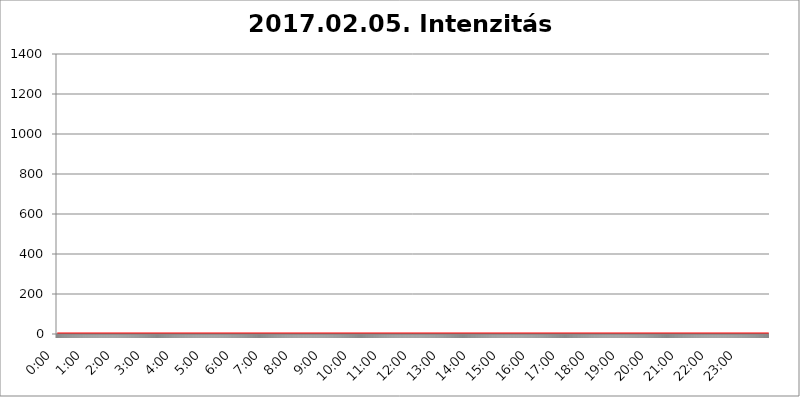
| Category | 2017.02.05. Intenzitás [W/m^2] |
|---|---|
| 0.0 | 0 |
| 0.0006944444444444445 | 0 |
| 0.001388888888888889 | 0 |
| 0.0020833333333333333 | 0 |
| 0.002777777777777778 | 0 |
| 0.003472222222222222 | 0 |
| 0.004166666666666667 | 0 |
| 0.004861111111111111 | 0 |
| 0.005555555555555556 | 0 |
| 0.0062499999999999995 | 0 |
| 0.006944444444444444 | 0 |
| 0.007638888888888889 | 0 |
| 0.008333333333333333 | 0 |
| 0.009027777777777779 | 0 |
| 0.009722222222222222 | 0 |
| 0.010416666666666666 | 0 |
| 0.011111111111111112 | 0 |
| 0.011805555555555555 | 0 |
| 0.012499999999999999 | 0 |
| 0.013194444444444444 | 0 |
| 0.013888888888888888 | 0 |
| 0.014583333333333332 | 0 |
| 0.015277777777777777 | 0 |
| 0.015972222222222224 | 0 |
| 0.016666666666666666 | 0 |
| 0.017361111111111112 | 0 |
| 0.018055555555555557 | 0 |
| 0.01875 | 0 |
| 0.019444444444444445 | 0 |
| 0.02013888888888889 | 0 |
| 0.020833333333333332 | 0 |
| 0.02152777777777778 | 0 |
| 0.022222222222222223 | 0 |
| 0.02291666666666667 | 0 |
| 0.02361111111111111 | 0 |
| 0.024305555555555556 | 0 |
| 0.024999999999999998 | 0 |
| 0.025694444444444447 | 0 |
| 0.02638888888888889 | 0 |
| 0.027083333333333334 | 0 |
| 0.027777777777777776 | 0 |
| 0.02847222222222222 | 0 |
| 0.029166666666666664 | 0 |
| 0.029861111111111113 | 0 |
| 0.030555555555555555 | 0 |
| 0.03125 | 0 |
| 0.03194444444444445 | 0 |
| 0.03263888888888889 | 0 |
| 0.03333333333333333 | 0 |
| 0.034027777777777775 | 0 |
| 0.034722222222222224 | 0 |
| 0.035416666666666666 | 0 |
| 0.036111111111111115 | 0 |
| 0.03680555555555556 | 0 |
| 0.0375 | 0 |
| 0.03819444444444444 | 0 |
| 0.03888888888888889 | 0 |
| 0.03958333333333333 | 0 |
| 0.04027777777777778 | 0 |
| 0.04097222222222222 | 0 |
| 0.041666666666666664 | 0 |
| 0.042361111111111106 | 0 |
| 0.04305555555555556 | 0 |
| 0.043750000000000004 | 0 |
| 0.044444444444444446 | 0 |
| 0.04513888888888889 | 0 |
| 0.04583333333333334 | 0 |
| 0.04652777777777778 | 0 |
| 0.04722222222222222 | 0 |
| 0.04791666666666666 | 0 |
| 0.04861111111111111 | 0 |
| 0.049305555555555554 | 0 |
| 0.049999999999999996 | 0 |
| 0.05069444444444445 | 0 |
| 0.051388888888888894 | 0 |
| 0.052083333333333336 | 0 |
| 0.05277777777777778 | 0 |
| 0.05347222222222222 | 0 |
| 0.05416666666666667 | 0 |
| 0.05486111111111111 | 0 |
| 0.05555555555555555 | 0 |
| 0.05625 | 0 |
| 0.05694444444444444 | 0 |
| 0.057638888888888885 | 0 |
| 0.05833333333333333 | 0 |
| 0.05902777777777778 | 0 |
| 0.059722222222222225 | 0 |
| 0.06041666666666667 | 0 |
| 0.061111111111111116 | 0 |
| 0.06180555555555556 | 0 |
| 0.0625 | 0 |
| 0.06319444444444444 | 0 |
| 0.06388888888888888 | 0 |
| 0.06458333333333334 | 0 |
| 0.06527777777777778 | 0 |
| 0.06597222222222222 | 0 |
| 0.06666666666666667 | 0 |
| 0.06736111111111111 | 0 |
| 0.06805555555555555 | 0 |
| 0.06874999999999999 | 0 |
| 0.06944444444444443 | 0 |
| 0.07013888888888889 | 0 |
| 0.07083333333333333 | 0 |
| 0.07152777777777779 | 0 |
| 0.07222222222222223 | 0 |
| 0.07291666666666667 | 0 |
| 0.07361111111111111 | 0 |
| 0.07430555555555556 | 0 |
| 0.075 | 0 |
| 0.07569444444444444 | 0 |
| 0.0763888888888889 | 0 |
| 0.07708333333333334 | 0 |
| 0.07777777777777778 | 0 |
| 0.07847222222222222 | 0 |
| 0.07916666666666666 | 0 |
| 0.0798611111111111 | 0 |
| 0.08055555555555556 | 0 |
| 0.08125 | 0 |
| 0.08194444444444444 | 0 |
| 0.08263888888888889 | 0 |
| 0.08333333333333333 | 0 |
| 0.08402777777777777 | 0 |
| 0.08472222222222221 | 0 |
| 0.08541666666666665 | 0 |
| 0.08611111111111112 | 0 |
| 0.08680555555555557 | 0 |
| 0.08750000000000001 | 0 |
| 0.08819444444444445 | 0 |
| 0.08888888888888889 | 0 |
| 0.08958333333333333 | 0 |
| 0.09027777777777778 | 0 |
| 0.09097222222222222 | 0 |
| 0.09166666666666667 | 0 |
| 0.09236111111111112 | 0 |
| 0.09305555555555556 | 0 |
| 0.09375 | 0 |
| 0.09444444444444444 | 0 |
| 0.09513888888888888 | 0 |
| 0.09583333333333333 | 0 |
| 0.09652777777777777 | 0 |
| 0.09722222222222222 | 0 |
| 0.09791666666666667 | 0 |
| 0.09861111111111111 | 0 |
| 0.09930555555555555 | 0 |
| 0.09999999999999999 | 0 |
| 0.10069444444444443 | 0 |
| 0.1013888888888889 | 0 |
| 0.10208333333333335 | 0 |
| 0.10277777777777779 | 0 |
| 0.10347222222222223 | 0 |
| 0.10416666666666667 | 0 |
| 0.10486111111111111 | 0 |
| 0.10555555555555556 | 0 |
| 0.10625 | 0 |
| 0.10694444444444444 | 0 |
| 0.1076388888888889 | 0 |
| 0.10833333333333334 | 0 |
| 0.10902777777777778 | 0 |
| 0.10972222222222222 | 0 |
| 0.1111111111111111 | 0 |
| 0.11180555555555556 | 0 |
| 0.11180555555555556 | 0 |
| 0.1125 | 0 |
| 0.11319444444444444 | 0 |
| 0.11388888888888889 | 0 |
| 0.11458333333333333 | 0 |
| 0.11527777777777777 | 0 |
| 0.11597222222222221 | 0 |
| 0.11666666666666665 | 0 |
| 0.1173611111111111 | 0 |
| 0.11805555555555557 | 0 |
| 0.11944444444444445 | 0 |
| 0.12013888888888889 | 0 |
| 0.12083333333333333 | 0 |
| 0.12152777777777778 | 0 |
| 0.12222222222222223 | 0 |
| 0.12291666666666667 | 0 |
| 0.12291666666666667 | 0 |
| 0.12361111111111112 | 0 |
| 0.12430555555555556 | 0 |
| 0.125 | 0 |
| 0.12569444444444444 | 0 |
| 0.12638888888888888 | 0 |
| 0.12708333333333333 | 0 |
| 0.16875 | 0 |
| 0.12847222222222224 | 0 |
| 0.12916666666666668 | 0 |
| 0.12986111111111112 | 0 |
| 0.13055555555555556 | 0 |
| 0.13125 | 0 |
| 0.13194444444444445 | 0 |
| 0.1326388888888889 | 0 |
| 0.13333333333333333 | 0 |
| 0.13402777777777777 | 0 |
| 0.13402777777777777 | 0 |
| 0.13472222222222222 | 0 |
| 0.13541666666666666 | 0 |
| 0.1361111111111111 | 0 |
| 0.13749999999999998 | 0 |
| 0.13819444444444443 | 0 |
| 0.1388888888888889 | 0 |
| 0.13958333333333334 | 0 |
| 0.14027777777777778 | 0 |
| 0.14097222222222222 | 0 |
| 0.14166666666666666 | 0 |
| 0.1423611111111111 | 0 |
| 0.14305555555555557 | 0 |
| 0.14375000000000002 | 0 |
| 0.14444444444444446 | 0 |
| 0.1451388888888889 | 0 |
| 0.1451388888888889 | 0 |
| 0.14652777777777778 | 0 |
| 0.14722222222222223 | 0 |
| 0.14791666666666667 | 0 |
| 0.1486111111111111 | 0 |
| 0.14930555555555555 | 0 |
| 0.15 | 0 |
| 0.15069444444444444 | 0 |
| 0.15138888888888888 | 0 |
| 0.15208333333333332 | 0 |
| 0.15277777777777776 | 0 |
| 0.15347222222222223 | 0 |
| 0.15416666666666667 | 0 |
| 0.15486111111111112 | 0 |
| 0.15555555555555556 | 0 |
| 0.15625 | 0 |
| 0.15694444444444444 | 0 |
| 0.15763888888888888 | 0 |
| 0.15833333333333333 | 0 |
| 0.15902777777777777 | 0 |
| 0.15972222222222224 | 0 |
| 0.16041666666666668 | 0 |
| 0.16111111111111112 | 0 |
| 0.16180555555555556 | 0 |
| 0.1625 | 0 |
| 0.16319444444444445 | 0 |
| 0.1638888888888889 | 0 |
| 0.16458333333333333 | 0 |
| 0.16527777777777777 | 0 |
| 0.16597222222222222 | 0 |
| 0.16666666666666666 | 0 |
| 0.1673611111111111 | 0 |
| 0.16805555555555554 | 0 |
| 0.16874999999999998 | 0 |
| 0.16944444444444443 | 0 |
| 0.17013888888888887 | 0 |
| 0.1708333333333333 | 0 |
| 0.17152777777777775 | 0 |
| 0.17222222222222225 | 0 |
| 0.1729166666666667 | 0 |
| 0.17361111111111113 | 0 |
| 0.17430555555555557 | 0 |
| 0.17500000000000002 | 0 |
| 0.17569444444444446 | 0 |
| 0.1763888888888889 | 0 |
| 0.17708333333333334 | 0 |
| 0.17777777777777778 | 0 |
| 0.17847222222222223 | 0 |
| 0.17916666666666667 | 0 |
| 0.1798611111111111 | 0 |
| 0.18055555555555555 | 0 |
| 0.18125 | 0 |
| 0.18194444444444444 | 0 |
| 0.1826388888888889 | 0 |
| 0.18333333333333335 | 0 |
| 0.1840277777777778 | 0 |
| 0.18472222222222223 | 0 |
| 0.18541666666666667 | 0 |
| 0.18611111111111112 | 0 |
| 0.18680555555555556 | 0 |
| 0.1875 | 0 |
| 0.18819444444444444 | 0 |
| 0.18888888888888888 | 0 |
| 0.18958333333333333 | 0 |
| 0.19027777777777777 | 0 |
| 0.1909722222222222 | 0 |
| 0.19166666666666665 | 0 |
| 0.19236111111111112 | 0 |
| 0.19305555555555554 | 0 |
| 0.19375 | 0 |
| 0.19444444444444445 | 0 |
| 0.1951388888888889 | 0 |
| 0.19583333333333333 | 0 |
| 0.19652777777777777 | 0 |
| 0.19722222222222222 | 0 |
| 0.19791666666666666 | 0 |
| 0.1986111111111111 | 0 |
| 0.19930555555555554 | 0 |
| 0.19999999999999998 | 0 |
| 0.20069444444444443 | 0 |
| 0.20138888888888887 | 0 |
| 0.2020833333333333 | 0 |
| 0.2027777777777778 | 0 |
| 0.2034722222222222 | 0 |
| 0.2041666666666667 | 0 |
| 0.20486111111111113 | 0 |
| 0.20555555555555557 | 0 |
| 0.20625000000000002 | 0 |
| 0.20694444444444446 | 0 |
| 0.2076388888888889 | 0 |
| 0.20833333333333334 | 0 |
| 0.20902777777777778 | 0 |
| 0.20972222222222223 | 0 |
| 0.21041666666666667 | 0 |
| 0.2111111111111111 | 0 |
| 0.21180555555555555 | 0 |
| 0.2125 | 0 |
| 0.21319444444444444 | 0 |
| 0.2138888888888889 | 0 |
| 0.21458333333333335 | 0 |
| 0.2152777777777778 | 0 |
| 0.21597222222222223 | 0 |
| 0.21666666666666667 | 0 |
| 0.21736111111111112 | 0 |
| 0.21805555555555556 | 0 |
| 0.21875 | 0 |
| 0.21944444444444444 | 0 |
| 0.22013888888888888 | 0 |
| 0.22083333333333333 | 0 |
| 0.22152777777777777 | 0 |
| 0.2222222222222222 | 0 |
| 0.22291666666666665 | 0 |
| 0.2236111111111111 | 0 |
| 0.22430555555555556 | 0 |
| 0.225 | 0 |
| 0.22569444444444445 | 0 |
| 0.2263888888888889 | 0 |
| 0.22708333333333333 | 0 |
| 0.22777777777777777 | 0 |
| 0.22847222222222222 | 0 |
| 0.22916666666666666 | 0 |
| 0.2298611111111111 | 0 |
| 0.23055555555555554 | 0 |
| 0.23124999999999998 | 0 |
| 0.23194444444444443 | 0 |
| 0.23263888888888887 | 0 |
| 0.2333333333333333 | 0 |
| 0.2340277777777778 | 0 |
| 0.2347222222222222 | 0 |
| 0.2354166666666667 | 0 |
| 0.23611111111111113 | 0 |
| 0.23680555555555557 | 0 |
| 0.23750000000000002 | 0 |
| 0.23819444444444446 | 0 |
| 0.2388888888888889 | 0 |
| 0.23958333333333334 | 0 |
| 0.24027777777777778 | 0 |
| 0.24097222222222223 | 0 |
| 0.24166666666666667 | 0 |
| 0.2423611111111111 | 0 |
| 0.24305555555555555 | 0 |
| 0.24375 | 0 |
| 0.24444444444444446 | 0 |
| 0.24513888888888888 | 0 |
| 0.24583333333333335 | 0 |
| 0.2465277777777778 | 0 |
| 0.24722222222222223 | 0 |
| 0.24791666666666667 | 0 |
| 0.24861111111111112 | 0 |
| 0.24930555555555556 | 0 |
| 0.25 | 0 |
| 0.25069444444444444 | 0 |
| 0.2513888888888889 | 0 |
| 0.2520833333333333 | 0 |
| 0.25277777777777777 | 0 |
| 0.2534722222222222 | 0 |
| 0.25416666666666665 | 0 |
| 0.2548611111111111 | 0 |
| 0.2555555555555556 | 0 |
| 0.25625000000000003 | 0 |
| 0.2569444444444445 | 0 |
| 0.2576388888888889 | 0 |
| 0.25833333333333336 | 0 |
| 0.2590277777777778 | 0 |
| 0.25972222222222224 | 0 |
| 0.2604166666666667 | 0 |
| 0.2611111111111111 | 0 |
| 0.26180555555555557 | 0 |
| 0.2625 | 0 |
| 0.26319444444444445 | 0 |
| 0.2638888888888889 | 0 |
| 0.26458333333333334 | 0 |
| 0.2652777777777778 | 0 |
| 0.2659722222222222 | 0 |
| 0.26666666666666666 | 0 |
| 0.2673611111111111 | 0 |
| 0.26805555555555555 | 0 |
| 0.26875 | 0 |
| 0.26944444444444443 | 0 |
| 0.2701388888888889 | 0 |
| 0.2708333333333333 | 0 |
| 0.27152777777777776 | 0 |
| 0.2722222222222222 | 0 |
| 0.27291666666666664 | 0 |
| 0.2736111111111111 | 0 |
| 0.2743055555555555 | 0 |
| 0.27499999999999997 | 0 |
| 0.27569444444444446 | 0 |
| 0.27638888888888885 | 0 |
| 0.27708333333333335 | 0 |
| 0.2777777777777778 | 0 |
| 0.27847222222222223 | 0 |
| 0.2791666666666667 | 0 |
| 0.2798611111111111 | 0 |
| 0.28055555555555556 | 0 |
| 0.28125 | 0 |
| 0.28194444444444444 | 0 |
| 0.2826388888888889 | 0 |
| 0.2833333333333333 | 0 |
| 0.28402777777777777 | 0 |
| 0.2847222222222222 | 0 |
| 0.28541666666666665 | 0 |
| 0.28611111111111115 | 0 |
| 0.28680555555555554 | 0 |
| 0.28750000000000003 | 0 |
| 0.2881944444444445 | 0 |
| 0.2888888888888889 | 0 |
| 0.28958333333333336 | 0 |
| 0.2902777777777778 | 0 |
| 0.29097222222222224 | 0 |
| 0.2916666666666667 | 0 |
| 0.2923611111111111 | 0 |
| 0.29305555555555557 | 0 |
| 0.29375 | 0 |
| 0.29444444444444445 | 0 |
| 0.2951388888888889 | 0 |
| 0.29583333333333334 | 0 |
| 0.2965277777777778 | 0 |
| 0.2972222222222222 | 0 |
| 0.29791666666666666 | 0 |
| 0.2986111111111111 | 0 |
| 0.29930555555555555 | 0 |
| 0.3 | 0 |
| 0.30069444444444443 | 0 |
| 0.3013888888888889 | 0 |
| 0.3020833333333333 | 0 |
| 0.30277777777777776 | 0 |
| 0.3034722222222222 | 0 |
| 0.30416666666666664 | 0 |
| 0.3048611111111111 | 0 |
| 0.3055555555555555 | 0 |
| 0.30624999999999997 | 0 |
| 0.3069444444444444 | 0 |
| 0.3076388888888889 | 0 |
| 0.30833333333333335 | 0 |
| 0.3090277777777778 | 0 |
| 0.30972222222222223 | 0 |
| 0.3104166666666667 | 0 |
| 0.3111111111111111 | 0 |
| 0.31180555555555556 | 0 |
| 0.3125 | 0 |
| 0.31319444444444444 | 0 |
| 0.3138888888888889 | 0 |
| 0.3145833333333333 | 0 |
| 0.31527777777777777 | 0 |
| 0.3159722222222222 | 0 |
| 0.31666666666666665 | 0 |
| 0.31736111111111115 | 0 |
| 0.31805555555555554 | 0 |
| 0.31875000000000003 | 0 |
| 0.3194444444444445 | 0 |
| 0.3201388888888889 | 0 |
| 0.32083333333333336 | 0 |
| 0.3215277777777778 | 0 |
| 0.32222222222222224 | 0 |
| 0.3229166666666667 | 0 |
| 0.3236111111111111 | 0 |
| 0.32430555555555557 | 0 |
| 0.325 | 0 |
| 0.32569444444444445 | 0 |
| 0.3263888888888889 | 0 |
| 0.32708333333333334 | 0 |
| 0.3277777777777778 | 0 |
| 0.3284722222222222 | 0 |
| 0.32916666666666666 | 0 |
| 0.3298611111111111 | 0 |
| 0.33055555555555555 | 0 |
| 0.33125 | 0 |
| 0.33194444444444443 | 0 |
| 0.3326388888888889 | 0 |
| 0.3333333333333333 | 0 |
| 0.3340277777777778 | 0 |
| 0.3347222222222222 | 0 |
| 0.3354166666666667 | 0 |
| 0.3361111111111111 | 0 |
| 0.3368055555555556 | 0 |
| 0.33749999999999997 | 0 |
| 0.33819444444444446 | 0 |
| 0.33888888888888885 | 0 |
| 0.33958333333333335 | 0 |
| 0.34027777777777773 | 0 |
| 0.34097222222222223 | 0 |
| 0.3416666666666666 | 0 |
| 0.3423611111111111 | 0 |
| 0.3430555555555555 | 0 |
| 0.34375 | 0 |
| 0.3444444444444445 | 0 |
| 0.3451388888888889 | 0 |
| 0.3458333333333334 | 0 |
| 0.34652777777777777 | 0 |
| 0.34722222222222227 | 0 |
| 0.34791666666666665 | 0 |
| 0.34861111111111115 | 0 |
| 0.34930555555555554 | 0 |
| 0.35000000000000003 | 0 |
| 0.3506944444444444 | 0 |
| 0.3513888888888889 | 0 |
| 0.3520833333333333 | 0 |
| 0.3527777777777778 | 0 |
| 0.3534722222222222 | 0 |
| 0.3541666666666667 | 0 |
| 0.3548611111111111 | 0 |
| 0.35555555555555557 | 0 |
| 0.35625 | 0 |
| 0.35694444444444445 | 0 |
| 0.3576388888888889 | 0 |
| 0.35833333333333334 | 0 |
| 0.3590277777777778 | 0 |
| 0.3597222222222222 | 0 |
| 0.36041666666666666 | 0 |
| 0.3611111111111111 | 0 |
| 0.36180555555555555 | 0 |
| 0.3625 | 0 |
| 0.36319444444444443 | 0 |
| 0.3638888888888889 | 0 |
| 0.3645833333333333 | 0 |
| 0.3652777777777778 | 0 |
| 0.3659722222222222 | 0 |
| 0.3666666666666667 | 0 |
| 0.3673611111111111 | 0 |
| 0.3680555555555556 | 0 |
| 0.36874999999999997 | 0 |
| 0.36944444444444446 | 0 |
| 0.37013888888888885 | 0 |
| 0.37083333333333335 | 0 |
| 0.37152777777777773 | 0 |
| 0.37222222222222223 | 0 |
| 0.3729166666666666 | 0 |
| 0.3736111111111111 | 0 |
| 0.3743055555555555 | 0 |
| 0.375 | 0 |
| 0.3756944444444445 | 0 |
| 0.3763888888888889 | 0 |
| 0.3770833333333334 | 0 |
| 0.37777777777777777 | 0 |
| 0.37847222222222227 | 0 |
| 0.37916666666666665 | 0 |
| 0.37986111111111115 | 0 |
| 0.38055555555555554 | 0 |
| 0.38125000000000003 | 0 |
| 0.3819444444444444 | 0 |
| 0.3826388888888889 | 0 |
| 0.3833333333333333 | 0 |
| 0.3840277777777778 | 0 |
| 0.3847222222222222 | 0 |
| 0.3854166666666667 | 0 |
| 0.3861111111111111 | 0 |
| 0.38680555555555557 | 0 |
| 0.3875 | 0 |
| 0.38819444444444445 | 0 |
| 0.3888888888888889 | 0 |
| 0.38958333333333334 | 0 |
| 0.3902777777777778 | 0 |
| 0.3909722222222222 | 0 |
| 0.39166666666666666 | 0 |
| 0.3923611111111111 | 0 |
| 0.39305555555555555 | 0 |
| 0.39375 | 0 |
| 0.39444444444444443 | 0 |
| 0.3951388888888889 | 0 |
| 0.3958333333333333 | 0 |
| 0.3965277777777778 | 0 |
| 0.3972222222222222 | 0 |
| 0.3979166666666667 | 0 |
| 0.3986111111111111 | 0 |
| 0.3993055555555556 | 0 |
| 0.39999999999999997 | 0 |
| 0.40069444444444446 | 0 |
| 0.40138888888888885 | 0 |
| 0.40208333333333335 | 0 |
| 0.40277777777777773 | 0 |
| 0.40347222222222223 | 0 |
| 0.4041666666666666 | 0 |
| 0.4048611111111111 | 0 |
| 0.4055555555555555 | 0 |
| 0.40625 | 0 |
| 0.4069444444444445 | 0 |
| 0.4076388888888889 | 0 |
| 0.4083333333333334 | 0 |
| 0.40902777777777777 | 0 |
| 0.40972222222222227 | 0 |
| 0.41041666666666665 | 0 |
| 0.41111111111111115 | 0 |
| 0.41180555555555554 | 0 |
| 0.41250000000000003 | 0 |
| 0.4131944444444444 | 0 |
| 0.4138888888888889 | 0 |
| 0.4145833333333333 | 0 |
| 0.4152777777777778 | 0 |
| 0.4159722222222222 | 0 |
| 0.4166666666666667 | 0 |
| 0.4173611111111111 | 0 |
| 0.41805555555555557 | 0 |
| 0.41875 | 0 |
| 0.41944444444444445 | 0 |
| 0.4201388888888889 | 0 |
| 0.42083333333333334 | 0 |
| 0.4215277777777778 | 0 |
| 0.4222222222222222 | 0 |
| 0.42291666666666666 | 0 |
| 0.4236111111111111 | 0 |
| 0.42430555555555555 | 0 |
| 0.425 | 0 |
| 0.42569444444444443 | 0 |
| 0.4263888888888889 | 0 |
| 0.4270833333333333 | 0 |
| 0.4277777777777778 | 0 |
| 0.4284722222222222 | 0 |
| 0.4291666666666667 | 0 |
| 0.4298611111111111 | 0 |
| 0.4305555555555556 | 0 |
| 0.43124999999999997 | 0 |
| 0.43194444444444446 | 0 |
| 0.43263888888888885 | 0 |
| 0.43333333333333335 | 0 |
| 0.43402777777777773 | 0 |
| 0.43472222222222223 | 0 |
| 0.4354166666666666 | 0 |
| 0.4361111111111111 | 0 |
| 0.4368055555555555 | 0 |
| 0.4375 | 0 |
| 0.4381944444444445 | 0 |
| 0.4388888888888889 | 0 |
| 0.4395833333333334 | 0 |
| 0.44027777777777777 | 0 |
| 0.44097222222222227 | 0 |
| 0.44166666666666665 | 0 |
| 0.44236111111111115 | 0 |
| 0.44305555555555554 | 0 |
| 0.44375000000000003 | 0 |
| 0.4444444444444444 | 0 |
| 0.4451388888888889 | 0 |
| 0.4458333333333333 | 0 |
| 0.4465277777777778 | 0 |
| 0.4472222222222222 | 0 |
| 0.4479166666666667 | 0 |
| 0.4486111111111111 | 0 |
| 0.44930555555555557 | 0 |
| 0.45 | 0 |
| 0.45069444444444445 | 0 |
| 0.4513888888888889 | 0 |
| 0.45208333333333334 | 0 |
| 0.4527777777777778 | 0 |
| 0.4534722222222222 | 0 |
| 0.45416666666666666 | 0 |
| 0.4548611111111111 | 0 |
| 0.45555555555555555 | 0 |
| 0.45625 | 0 |
| 0.45694444444444443 | 0 |
| 0.4576388888888889 | 0 |
| 0.4583333333333333 | 0 |
| 0.4590277777777778 | 0 |
| 0.4597222222222222 | 0 |
| 0.4604166666666667 | 0 |
| 0.4611111111111111 | 0 |
| 0.4618055555555556 | 0 |
| 0.46249999999999997 | 0 |
| 0.46319444444444446 | 0 |
| 0.46388888888888885 | 0 |
| 0.46458333333333335 | 0 |
| 0.46527777777777773 | 0 |
| 0.46597222222222223 | 0 |
| 0.4666666666666666 | 0 |
| 0.4673611111111111 | 0 |
| 0.4680555555555555 | 0 |
| 0.46875 | 0 |
| 0.4694444444444445 | 0 |
| 0.4701388888888889 | 0 |
| 0.4708333333333334 | 0 |
| 0.47152777777777777 | 0 |
| 0.47222222222222227 | 0 |
| 0.47291666666666665 | 0 |
| 0.47361111111111115 | 0 |
| 0.47430555555555554 | 0 |
| 0.47500000000000003 | 0 |
| 0.4756944444444444 | 0 |
| 0.4763888888888889 | 0 |
| 0.4770833333333333 | 0 |
| 0.4777777777777778 | 0 |
| 0.4784722222222222 | 0 |
| 0.4791666666666667 | 0 |
| 0.4798611111111111 | 0 |
| 0.48055555555555557 | 0 |
| 0.48125 | 0 |
| 0.48194444444444445 | 0 |
| 0.4826388888888889 | 0 |
| 0.48333333333333334 | 0 |
| 0.4840277777777778 | 0 |
| 0.4847222222222222 | 0 |
| 0.48541666666666666 | 0 |
| 0.4861111111111111 | 0 |
| 0.48680555555555555 | 0 |
| 0.4875 | 0 |
| 0.48819444444444443 | 0 |
| 0.4888888888888889 | 0 |
| 0.4895833333333333 | 0 |
| 0.4902777777777778 | 0 |
| 0.4909722222222222 | 0 |
| 0.4916666666666667 | 0 |
| 0.4923611111111111 | 0 |
| 0.4930555555555556 | 0 |
| 0.49374999999999997 | 0 |
| 0.49444444444444446 | 0 |
| 0.49513888888888885 | 0 |
| 0.49583333333333335 | 0 |
| 0.49652777777777773 | 0 |
| 0.49722222222222223 | 0 |
| 0.4979166666666666 | 0 |
| 0.4986111111111111 | 0 |
| 0.4993055555555555 | 0 |
| 0.5 | 0 |
| 0.5006944444444444 | 0 |
| 0.5013888888888889 | 0 |
| 0.5020833333333333 | 0 |
| 0.5027777777777778 | 0 |
| 0.5034722222222222 | 0 |
| 0.5041666666666667 | 0 |
| 0.5048611111111111 | 0 |
| 0.5055555555555555 | 0 |
| 0.50625 | 0 |
| 0.5069444444444444 | 0 |
| 0.5076388888888889 | 0 |
| 0.5083333333333333 | 0 |
| 0.5090277777777777 | 0 |
| 0.5097222222222222 | 0 |
| 0.5104166666666666 | 0 |
| 0.5111111111111112 | 0 |
| 0.5118055555555555 | 0 |
| 0.5125000000000001 | 0 |
| 0.5131944444444444 | 0 |
| 0.513888888888889 | 0 |
| 0.5145833333333333 | 0 |
| 0.5152777777777778 | 0 |
| 0.5159722222222222 | 0 |
| 0.5166666666666667 | 0 |
| 0.517361111111111 | 0 |
| 0.5180555555555556 | 0 |
| 0.5187499999999999 | 0 |
| 0.5194444444444445 | 0 |
| 0.5201388888888888 | 0 |
| 0.5208333333333334 | 0 |
| 0.5215277777777778 | 0 |
| 0.5222222222222223 | 0 |
| 0.5229166666666667 | 0 |
| 0.5236111111111111 | 0 |
| 0.5243055555555556 | 0 |
| 0.525 | 0 |
| 0.5256944444444445 | 0 |
| 0.5263888888888889 | 0 |
| 0.5270833333333333 | 0 |
| 0.5277777777777778 | 0 |
| 0.5284722222222222 | 0 |
| 0.5291666666666667 | 0 |
| 0.5298611111111111 | 0 |
| 0.5305555555555556 | 0 |
| 0.53125 | 0 |
| 0.5319444444444444 | 0 |
| 0.5326388888888889 | 0 |
| 0.5333333333333333 | 0 |
| 0.5340277777777778 | 0 |
| 0.5347222222222222 | 0 |
| 0.5354166666666667 | 0 |
| 0.5361111111111111 | 0 |
| 0.5368055555555555 | 0 |
| 0.5375 | 0 |
| 0.5381944444444444 | 0 |
| 0.5388888888888889 | 0 |
| 0.5395833333333333 | 0 |
| 0.5402777777777777 | 0 |
| 0.5409722222222222 | 0 |
| 0.5416666666666666 | 0 |
| 0.5423611111111112 | 0 |
| 0.5430555555555555 | 0 |
| 0.5437500000000001 | 0 |
| 0.5444444444444444 | 0 |
| 0.545138888888889 | 0 |
| 0.5458333333333333 | 0 |
| 0.5465277777777778 | 0 |
| 0.5472222222222222 | 0 |
| 0.5479166666666667 | 0 |
| 0.548611111111111 | 0 |
| 0.5493055555555556 | 0 |
| 0.5499999999999999 | 0 |
| 0.5506944444444445 | 0 |
| 0.5513888888888888 | 0 |
| 0.5520833333333334 | 0 |
| 0.5527777777777778 | 0 |
| 0.5534722222222223 | 0 |
| 0.5541666666666667 | 0 |
| 0.5548611111111111 | 0 |
| 0.5555555555555556 | 0 |
| 0.55625 | 0 |
| 0.5569444444444445 | 0 |
| 0.5576388888888889 | 0 |
| 0.5583333333333333 | 0 |
| 0.5590277777777778 | 0 |
| 0.5597222222222222 | 0 |
| 0.5604166666666667 | 0 |
| 0.5611111111111111 | 0 |
| 0.5618055555555556 | 0 |
| 0.5625 | 0 |
| 0.5631944444444444 | 0 |
| 0.5638888888888889 | 0 |
| 0.5645833333333333 | 0 |
| 0.5652777777777778 | 0 |
| 0.5659722222222222 | 0 |
| 0.5666666666666667 | 0 |
| 0.5673611111111111 | 0 |
| 0.5680555555555555 | 0 |
| 0.56875 | 0 |
| 0.5694444444444444 | 0 |
| 0.5701388888888889 | 0 |
| 0.5708333333333333 | 0 |
| 0.5715277777777777 | 0 |
| 0.5722222222222222 | 0 |
| 0.5729166666666666 | 0 |
| 0.5736111111111112 | 0 |
| 0.5743055555555555 | 0 |
| 0.5750000000000001 | 0 |
| 0.5756944444444444 | 0 |
| 0.576388888888889 | 0 |
| 0.5770833333333333 | 0 |
| 0.5777777777777778 | 0 |
| 0.5784722222222222 | 0 |
| 0.5791666666666667 | 0 |
| 0.579861111111111 | 0 |
| 0.5805555555555556 | 0 |
| 0.5812499999999999 | 0 |
| 0.5819444444444445 | 0 |
| 0.5826388888888888 | 0 |
| 0.5833333333333334 | 0 |
| 0.5840277777777778 | 0 |
| 0.5847222222222223 | 0 |
| 0.5854166666666667 | 0 |
| 0.5861111111111111 | 0 |
| 0.5868055555555556 | 0 |
| 0.5875 | 0 |
| 0.5881944444444445 | 0 |
| 0.5888888888888889 | 0 |
| 0.5895833333333333 | 0 |
| 0.5902777777777778 | 0 |
| 0.5909722222222222 | 0 |
| 0.5916666666666667 | 0 |
| 0.5923611111111111 | 0 |
| 0.5930555555555556 | 0 |
| 0.59375 | 0 |
| 0.5944444444444444 | 0 |
| 0.5951388888888889 | 0 |
| 0.5958333333333333 | 0 |
| 0.5965277777777778 | 0 |
| 0.5972222222222222 | 0 |
| 0.5979166666666667 | 0 |
| 0.5986111111111111 | 0 |
| 0.5993055555555555 | 0 |
| 0.6 | 0 |
| 0.6006944444444444 | 0 |
| 0.6013888888888889 | 0 |
| 0.6020833333333333 | 0 |
| 0.6027777777777777 | 0 |
| 0.6034722222222222 | 0 |
| 0.6041666666666666 | 0 |
| 0.6048611111111112 | 0 |
| 0.6055555555555555 | 0 |
| 0.6062500000000001 | 0 |
| 0.6069444444444444 | 0 |
| 0.607638888888889 | 0 |
| 0.6083333333333333 | 0 |
| 0.6090277777777778 | 0 |
| 0.6097222222222222 | 0 |
| 0.6104166666666667 | 0 |
| 0.611111111111111 | 0 |
| 0.6118055555555556 | 0 |
| 0.6124999999999999 | 0 |
| 0.6131944444444445 | 0 |
| 0.6138888888888888 | 0 |
| 0.6145833333333334 | 0 |
| 0.6152777777777778 | 0 |
| 0.6159722222222223 | 0 |
| 0.6166666666666667 | 0 |
| 0.6173611111111111 | 0 |
| 0.6180555555555556 | 0 |
| 0.61875 | 0 |
| 0.6194444444444445 | 0 |
| 0.6201388888888889 | 0 |
| 0.6208333333333333 | 0 |
| 0.6215277777777778 | 0 |
| 0.6222222222222222 | 0 |
| 0.6229166666666667 | 0 |
| 0.6236111111111111 | 0 |
| 0.6243055555555556 | 0 |
| 0.625 | 0 |
| 0.6256944444444444 | 0 |
| 0.6263888888888889 | 0 |
| 0.6270833333333333 | 0 |
| 0.6277777777777778 | 0 |
| 0.6284722222222222 | 0 |
| 0.6291666666666667 | 0 |
| 0.6298611111111111 | 0 |
| 0.6305555555555555 | 0 |
| 0.63125 | 0 |
| 0.6319444444444444 | 0 |
| 0.6326388888888889 | 0 |
| 0.6333333333333333 | 0 |
| 0.6340277777777777 | 0 |
| 0.6347222222222222 | 0 |
| 0.6354166666666666 | 0 |
| 0.6361111111111112 | 0 |
| 0.6368055555555555 | 0 |
| 0.6375000000000001 | 0 |
| 0.6381944444444444 | 0 |
| 0.638888888888889 | 0 |
| 0.6395833333333333 | 0 |
| 0.6402777777777778 | 0 |
| 0.6409722222222222 | 0 |
| 0.6416666666666667 | 0 |
| 0.642361111111111 | 0 |
| 0.6430555555555556 | 0 |
| 0.6437499999999999 | 0 |
| 0.6444444444444445 | 0 |
| 0.6451388888888888 | 0 |
| 0.6458333333333334 | 0 |
| 0.6465277777777778 | 0 |
| 0.6472222222222223 | 0 |
| 0.6479166666666667 | 0 |
| 0.6486111111111111 | 0 |
| 0.6493055555555556 | 0 |
| 0.65 | 0 |
| 0.6506944444444445 | 0 |
| 0.6513888888888889 | 0 |
| 0.6520833333333333 | 0 |
| 0.6527777777777778 | 0 |
| 0.6534722222222222 | 0 |
| 0.6541666666666667 | 0 |
| 0.6548611111111111 | 0 |
| 0.6555555555555556 | 0 |
| 0.65625 | 0 |
| 0.6569444444444444 | 0 |
| 0.6576388888888889 | 0 |
| 0.6583333333333333 | 0 |
| 0.6590277777777778 | 0 |
| 0.6597222222222222 | 0 |
| 0.6604166666666667 | 0 |
| 0.6611111111111111 | 0 |
| 0.6618055555555555 | 0 |
| 0.6625 | 0 |
| 0.6631944444444444 | 0 |
| 0.6638888888888889 | 0 |
| 0.6645833333333333 | 0 |
| 0.6652777777777777 | 0 |
| 0.6659722222222222 | 0 |
| 0.6666666666666666 | 0 |
| 0.6673611111111111 | 0 |
| 0.6680555555555556 | 0 |
| 0.6687500000000001 | 0 |
| 0.6694444444444444 | 0 |
| 0.6701388888888888 | 0 |
| 0.6708333333333334 | 0 |
| 0.6715277777777778 | 0 |
| 0.6722222222222222 | 0 |
| 0.6729166666666666 | 0 |
| 0.6736111111111112 | 0 |
| 0.6743055555555556 | 0 |
| 0.6749999999999999 | 0 |
| 0.6756944444444444 | 0 |
| 0.6763888888888889 | 0 |
| 0.6770833333333334 | 0 |
| 0.6777777777777777 | 0 |
| 0.6784722222222223 | 0 |
| 0.6791666666666667 | 0 |
| 0.6798611111111111 | 0 |
| 0.6805555555555555 | 0 |
| 0.68125 | 0 |
| 0.6819444444444445 | 0 |
| 0.6826388888888889 | 0 |
| 0.6833333333333332 | 0 |
| 0.6840277777777778 | 0 |
| 0.6847222222222222 | 0 |
| 0.6854166666666667 | 0 |
| 0.686111111111111 | 0 |
| 0.6868055555555556 | 0 |
| 0.6875 | 0 |
| 0.6881944444444444 | 0 |
| 0.688888888888889 | 0 |
| 0.6895833333333333 | 0 |
| 0.6902777777777778 | 0 |
| 0.6909722222222222 | 0 |
| 0.6916666666666668 | 0 |
| 0.6923611111111111 | 0 |
| 0.6930555555555555 | 0 |
| 0.69375 | 0 |
| 0.6944444444444445 | 0 |
| 0.6951388888888889 | 0 |
| 0.6958333333333333 | 0 |
| 0.6965277777777777 | 0 |
| 0.6972222222222223 | 0 |
| 0.6979166666666666 | 0 |
| 0.6986111111111111 | 0 |
| 0.6993055555555556 | 0 |
| 0.7000000000000001 | 0 |
| 0.7006944444444444 | 0 |
| 0.7013888888888888 | 0 |
| 0.7020833333333334 | 0 |
| 0.7027777777777778 | 0 |
| 0.7034722222222222 | 0 |
| 0.7041666666666666 | 0 |
| 0.7048611111111112 | 0 |
| 0.7055555555555556 | 0 |
| 0.7062499999999999 | 0 |
| 0.7069444444444444 | 0 |
| 0.7076388888888889 | 0 |
| 0.7083333333333334 | 0 |
| 0.7090277777777777 | 0 |
| 0.7097222222222223 | 0 |
| 0.7104166666666667 | 0 |
| 0.7111111111111111 | 0 |
| 0.7118055555555555 | 0 |
| 0.7125 | 0 |
| 0.7131944444444445 | 0 |
| 0.7138888888888889 | 0 |
| 0.7145833333333332 | 0 |
| 0.7152777777777778 | 0 |
| 0.7159722222222222 | 0 |
| 0.7166666666666667 | 0 |
| 0.717361111111111 | 0 |
| 0.7180555555555556 | 0 |
| 0.71875 | 0 |
| 0.7194444444444444 | 0 |
| 0.720138888888889 | 0 |
| 0.7208333333333333 | 0 |
| 0.7215277777777778 | 0 |
| 0.7222222222222222 | 0 |
| 0.7229166666666668 | 0 |
| 0.7236111111111111 | 0 |
| 0.7243055555555555 | 0 |
| 0.725 | 0 |
| 0.7256944444444445 | 0 |
| 0.7263888888888889 | 0 |
| 0.7270833333333333 | 0 |
| 0.7277777777777777 | 0 |
| 0.7284722222222223 | 0 |
| 0.7291666666666666 | 0 |
| 0.7298611111111111 | 0 |
| 0.7305555555555556 | 0 |
| 0.7312500000000001 | 0 |
| 0.7319444444444444 | 0 |
| 0.7326388888888888 | 0 |
| 0.7333333333333334 | 0 |
| 0.7340277777777778 | 0 |
| 0.7347222222222222 | 0 |
| 0.7354166666666666 | 0 |
| 0.7361111111111112 | 0 |
| 0.7368055555555556 | 0 |
| 0.7374999999999999 | 0 |
| 0.7381944444444444 | 0 |
| 0.7388888888888889 | 0 |
| 0.7395833333333334 | 0 |
| 0.7402777777777777 | 0 |
| 0.7409722222222223 | 0 |
| 0.7416666666666667 | 0 |
| 0.7423611111111111 | 0 |
| 0.7430555555555555 | 0 |
| 0.74375 | 0 |
| 0.7444444444444445 | 0 |
| 0.7451388888888889 | 0 |
| 0.7458333333333332 | 0 |
| 0.7465277777777778 | 0 |
| 0.7472222222222222 | 0 |
| 0.7479166666666667 | 0 |
| 0.748611111111111 | 0 |
| 0.7493055555555556 | 0 |
| 0.75 | 0 |
| 0.7506944444444444 | 0 |
| 0.751388888888889 | 0 |
| 0.7520833333333333 | 0 |
| 0.7527777777777778 | 0 |
| 0.7534722222222222 | 0 |
| 0.7541666666666668 | 0 |
| 0.7548611111111111 | 0 |
| 0.7555555555555555 | 0 |
| 0.75625 | 0 |
| 0.7569444444444445 | 0 |
| 0.7576388888888889 | 0 |
| 0.7583333333333333 | 0 |
| 0.7590277777777777 | 0 |
| 0.7597222222222223 | 0 |
| 0.7604166666666666 | 0 |
| 0.7611111111111111 | 0 |
| 0.7618055555555556 | 0 |
| 0.7625000000000001 | 0 |
| 0.7631944444444444 | 0 |
| 0.7638888888888888 | 0 |
| 0.7645833333333334 | 0 |
| 0.7652777777777778 | 0 |
| 0.7659722222222222 | 0 |
| 0.7666666666666666 | 0 |
| 0.7673611111111112 | 0 |
| 0.7680555555555556 | 0 |
| 0.7687499999999999 | 0 |
| 0.7694444444444444 | 0 |
| 0.7701388888888889 | 0 |
| 0.7708333333333334 | 0 |
| 0.7715277777777777 | 0 |
| 0.7722222222222223 | 0 |
| 0.7729166666666667 | 0 |
| 0.7736111111111111 | 0 |
| 0.7743055555555555 | 0 |
| 0.775 | 0 |
| 0.7756944444444445 | 0 |
| 0.7763888888888889 | 0 |
| 0.7770833333333332 | 0 |
| 0.7777777777777778 | 0 |
| 0.7784722222222222 | 0 |
| 0.7791666666666667 | 0 |
| 0.779861111111111 | 0 |
| 0.7805555555555556 | 0 |
| 0.78125 | 0 |
| 0.7819444444444444 | 0 |
| 0.782638888888889 | 0 |
| 0.7833333333333333 | 0 |
| 0.7840277777777778 | 0 |
| 0.7847222222222222 | 0 |
| 0.7854166666666668 | 0 |
| 0.7861111111111111 | 0 |
| 0.7868055555555555 | 0 |
| 0.7875 | 0 |
| 0.7881944444444445 | 0 |
| 0.7888888888888889 | 0 |
| 0.7895833333333333 | 0 |
| 0.7902777777777777 | 0 |
| 0.7909722222222223 | 0 |
| 0.7916666666666666 | 0 |
| 0.7923611111111111 | 0 |
| 0.7930555555555556 | 0 |
| 0.7937500000000001 | 0 |
| 0.7944444444444444 | 0 |
| 0.7951388888888888 | 0 |
| 0.7958333333333334 | 0 |
| 0.7965277777777778 | 0 |
| 0.7972222222222222 | 0 |
| 0.7979166666666666 | 0 |
| 0.7986111111111112 | 0 |
| 0.7993055555555556 | 0 |
| 0.7999999999999999 | 0 |
| 0.8006944444444444 | 0 |
| 0.8013888888888889 | 0 |
| 0.8020833333333334 | 0 |
| 0.8027777777777777 | 0 |
| 0.8034722222222223 | 0 |
| 0.8041666666666667 | 0 |
| 0.8048611111111111 | 0 |
| 0.8055555555555555 | 0 |
| 0.80625 | 0 |
| 0.8069444444444445 | 0 |
| 0.8076388888888889 | 0 |
| 0.8083333333333332 | 0 |
| 0.8090277777777778 | 0 |
| 0.8097222222222222 | 0 |
| 0.8104166666666667 | 0 |
| 0.811111111111111 | 0 |
| 0.8118055555555556 | 0 |
| 0.8125 | 0 |
| 0.8131944444444444 | 0 |
| 0.813888888888889 | 0 |
| 0.8145833333333333 | 0 |
| 0.8152777777777778 | 0 |
| 0.8159722222222222 | 0 |
| 0.8166666666666668 | 0 |
| 0.8173611111111111 | 0 |
| 0.8180555555555555 | 0 |
| 0.81875 | 0 |
| 0.8194444444444445 | 0 |
| 0.8201388888888889 | 0 |
| 0.8208333333333333 | 0 |
| 0.8215277777777777 | 0 |
| 0.8222222222222223 | 0 |
| 0.8229166666666666 | 0 |
| 0.8236111111111111 | 0 |
| 0.8243055555555556 | 0 |
| 0.8250000000000001 | 0 |
| 0.8256944444444444 | 0 |
| 0.8263888888888888 | 0 |
| 0.8270833333333334 | 0 |
| 0.8277777777777778 | 0 |
| 0.8284722222222222 | 0 |
| 0.8291666666666666 | 0 |
| 0.8298611111111112 | 0 |
| 0.8305555555555556 | 0 |
| 0.8312499999999999 | 0 |
| 0.8319444444444444 | 0 |
| 0.8326388888888889 | 0 |
| 0.8333333333333334 | 0 |
| 0.8340277777777777 | 0 |
| 0.8347222222222223 | 0 |
| 0.8354166666666667 | 0 |
| 0.8361111111111111 | 0 |
| 0.8368055555555555 | 0 |
| 0.8375 | 0 |
| 0.8381944444444445 | 0 |
| 0.8388888888888889 | 0 |
| 0.8395833333333332 | 0 |
| 0.8402777777777778 | 0 |
| 0.8409722222222222 | 0 |
| 0.8416666666666667 | 0 |
| 0.842361111111111 | 0 |
| 0.8430555555555556 | 0 |
| 0.84375 | 0 |
| 0.8444444444444444 | 0 |
| 0.845138888888889 | 0 |
| 0.8458333333333333 | 0 |
| 0.8465277777777778 | 0 |
| 0.8472222222222222 | 0 |
| 0.8479166666666668 | 0 |
| 0.8486111111111111 | 0 |
| 0.8493055555555555 | 0 |
| 0.85 | 0 |
| 0.8506944444444445 | 0 |
| 0.8513888888888889 | 0 |
| 0.8520833333333333 | 0 |
| 0.8527777777777777 | 0 |
| 0.8534722222222223 | 0 |
| 0.8541666666666666 | 0 |
| 0.8548611111111111 | 0 |
| 0.8555555555555556 | 0 |
| 0.8562500000000001 | 0 |
| 0.8569444444444444 | 0 |
| 0.8576388888888888 | 0 |
| 0.8583333333333334 | 0 |
| 0.8590277777777778 | 0 |
| 0.8597222222222222 | 0 |
| 0.8604166666666666 | 0 |
| 0.8611111111111112 | 0 |
| 0.8618055555555556 | 0 |
| 0.8624999999999999 | 0 |
| 0.8631944444444444 | 0 |
| 0.8638888888888889 | 0 |
| 0.8645833333333334 | 0 |
| 0.8652777777777777 | 0 |
| 0.8659722222222223 | 0 |
| 0.8666666666666667 | 0 |
| 0.8673611111111111 | 0 |
| 0.8680555555555555 | 0 |
| 0.86875 | 0 |
| 0.8694444444444445 | 0 |
| 0.8701388888888889 | 0 |
| 0.8708333333333332 | 0 |
| 0.8715277777777778 | 0 |
| 0.8722222222222222 | 0 |
| 0.8729166666666667 | 0 |
| 0.873611111111111 | 0 |
| 0.8743055555555556 | 0 |
| 0.875 | 0 |
| 0.8756944444444444 | 0 |
| 0.876388888888889 | 0 |
| 0.8770833333333333 | 0 |
| 0.8777777777777778 | 0 |
| 0.8784722222222222 | 0 |
| 0.8791666666666668 | 0 |
| 0.8798611111111111 | 0 |
| 0.8805555555555555 | 0 |
| 0.88125 | 0 |
| 0.8819444444444445 | 0 |
| 0.8826388888888889 | 0 |
| 0.8833333333333333 | 0 |
| 0.8840277777777777 | 0 |
| 0.8847222222222223 | 0 |
| 0.8854166666666666 | 0 |
| 0.8861111111111111 | 0 |
| 0.8868055555555556 | 0 |
| 0.8875000000000001 | 0 |
| 0.8881944444444444 | 0 |
| 0.8888888888888888 | 0 |
| 0.8895833333333334 | 0 |
| 0.8902777777777778 | 0 |
| 0.8909722222222222 | 0 |
| 0.8916666666666666 | 0 |
| 0.8923611111111112 | 0 |
| 0.8930555555555556 | 0 |
| 0.8937499999999999 | 0 |
| 0.8944444444444444 | 0 |
| 0.8951388888888889 | 0 |
| 0.8958333333333334 | 0 |
| 0.8965277777777777 | 0 |
| 0.8972222222222223 | 0 |
| 0.8979166666666667 | 0 |
| 0.8986111111111111 | 0 |
| 0.8993055555555555 | 0 |
| 0.9 | 0 |
| 0.9006944444444445 | 0 |
| 0.9013888888888889 | 0 |
| 0.9020833333333332 | 0 |
| 0.9027777777777778 | 0 |
| 0.9034722222222222 | 0 |
| 0.9041666666666667 | 0 |
| 0.904861111111111 | 0 |
| 0.9055555555555556 | 0 |
| 0.90625 | 0 |
| 0.9069444444444444 | 0 |
| 0.907638888888889 | 0 |
| 0.9083333333333333 | 0 |
| 0.9090277777777778 | 0 |
| 0.9097222222222222 | 0 |
| 0.9104166666666668 | 0 |
| 0.9111111111111111 | 0 |
| 0.9118055555555555 | 0 |
| 0.9125 | 0 |
| 0.9131944444444445 | 0 |
| 0.9138888888888889 | 0 |
| 0.9145833333333333 | 0 |
| 0.9152777777777777 | 0 |
| 0.9159722222222223 | 0 |
| 0.9166666666666666 | 0 |
| 0.9173611111111111 | 0 |
| 0.9180555555555556 | 0 |
| 0.9187500000000001 | 0 |
| 0.9194444444444444 | 0 |
| 0.9201388888888888 | 0 |
| 0.9208333333333334 | 0 |
| 0.9215277777777778 | 0 |
| 0.9222222222222222 | 0 |
| 0.9229166666666666 | 0 |
| 0.9236111111111112 | 0 |
| 0.9243055555555556 | 0 |
| 0.9249999999999999 | 0 |
| 0.9256944444444444 | 0 |
| 0.9263888888888889 | 0 |
| 0.9270833333333334 | 0 |
| 0.9277777777777777 | 0 |
| 0.9284722222222223 | 0 |
| 0.9291666666666667 | 0 |
| 0.9298611111111111 | 0 |
| 0.9305555555555555 | 0 |
| 0.93125 | 0 |
| 0.9319444444444445 | 0 |
| 0.9326388888888889 | 0 |
| 0.9333333333333332 | 0 |
| 0.9340277777777778 | 0 |
| 0.9347222222222222 | 0 |
| 0.9354166666666667 | 0 |
| 0.936111111111111 | 0 |
| 0.9368055555555556 | 0 |
| 0.9375 | 0 |
| 0.9381944444444444 | 0 |
| 0.938888888888889 | 0 |
| 0.9395833333333333 | 0 |
| 0.9402777777777778 | 0 |
| 0.9409722222222222 | 0 |
| 0.9416666666666668 | 0 |
| 0.9423611111111111 | 0 |
| 0.9430555555555555 | 0 |
| 0.94375 | 0 |
| 0.9444444444444445 | 0 |
| 0.9451388888888889 | 0 |
| 0.9458333333333333 | 0 |
| 0.9465277777777777 | 0 |
| 0.9472222222222223 | 0 |
| 0.9479166666666666 | 0 |
| 0.9486111111111111 | 0 |
| 0.9493055555555556 | 0 |
| 0.9500000000000001 | 0 |
| 0.9506944444444444 | 0 |
| 0.9513888888888888 | 0 |
| 0.9520833333333334 | 0 |
| 0.9527777777777778 | 0 |
| 0.9534722222222222 | 0 |
| 0.9541666666666666 | 0 |
| 0.9548611111111112 | 0 |
| 0.9555555555555556 | 0 |
| 0.9562499999999999 | 0 |
| 0.9569444444444444 | 0 |
| 0.9576388888888889 | 0 |
| 0.9583333333333334 | 0 |
| 0.9590277777777777 | 0 |
| 0.9597222222222223 | 0 |
| 0.9604166666666667 | 0 |
| 0.9611111111111111 | 0 |
| 0.9618055555555555 | 0 |
| 0.9625 | 0 |
| 0.9631944444444445 | 0 |
| 0.9638888888888889 | 0 |
| 0.9645833333333332 | 0 |
| 0.9652777777777778 | 0 |
| 0.9659722222222222 | 0 |
| 0.9666666666666667 | 0 |
| 0.967361111111111 | 0 |
| 0.9680555555555556 | 0 |
| 0.96875 | 0 |
| 0.9694444444444444 | 0 |
| 0.970138888888889 | 0 |
| 0.9708333333333333 | 0 |
| 0.9715277777777778 | 0 |
| 0.9722222222222222 | 0 |
| 0.9729166666666668 | 0 |
| 0.9736111111111111 | 0 |
| 0.9743055555555555 | 0 |
| 0.975 | 0 |
| 0.9756944444444445 | 0 |
| 0.9763888888888889 | 0 |
| 0.9770833333333333 | 0 |
| 0.9777777777777777 | 0 |
| 0.9784722222222223 | 0 |
| 0.9791666666666666 | 0 |
| 0.9798611111111111 | 0 |
| 0.9805555555555556 | 0 |
| 0.9812500000000001 | 0 |
| 0.9819444444444444 | 0 |
| 0.9826388888888888 | 0 |
| 0.9833333333333334 | 0 |
| 0.9840277777777778 | 0 |
| 0.9847222222222222 | 0 |
| 0.9854166666666666 | 0 |
| 0.9861111111111112 | 0 |
| 0.9868055555555556 | 0 |
| 0.9874999999999999 | 0 |
| 0.9881944444444444 | 0 |
| 0.9888888888888889 | 0 |
| 0.9895833333333334 | 0 |
| 0.9902777777777777 | 0 |
| 0.9909722222222223 | 0 |
| 0.9916666666666667 | 0 |
| 0.9923611111111111 | 0 |
| 0.9930555555555555 | 0 |
| 0.99375 | 0 |
| 0.9944444444444445 | 0 |
| 0.9951388888888889 | 0 |
| 0.9958333333333332 | 0 |
| 0.9965277777777778 | 0 |
| 0.9972222222222222 | 0 |
| 0.9979166666666667 | 0 |
| 0.998611111111111 | 0 |
| 0.9993055555555556 | 0 |